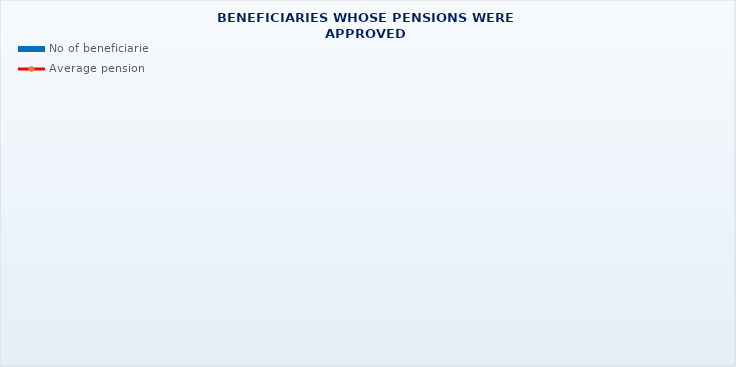
| Category | No of beneficiaries |
|---|---|
| Authorised officials in internal affairs, judicial officers and workers engaged in demining work: | 17264 |
| Active military personnel - DVO  | 15756 |
| Croatian Homeland Army veterans mobilised from 1941 to 1945 | 3783 |
| Former political prisoners | 2748 |
| Croatian Veterans from the Homeland War - ZOHBDR (Act on Croatian Homeland War Veterans and Their Family Members) | 71193 |
| Pensions approved under general regulations and determined according to the Act on the Rights of Croatian Homeland War Veterans and their Family Members (ZOHBDR), in 2017 (Art. 27, 35, 48 and 49, paragraph 2)    | 44387 |
| Former Yugoslav People's Army members - JNA   | 5245 |
| Former Yugoslav People's Army members - JNA - Art. 185 of Pension Insurance Act (ZOMO)  | 145 |
| National Liberation War veterans - NOR | 9101 |
| Members of the Croatian Parliament, members of the Government, judges of the Constitutional Court and the Auditor General | 673 |
| Members of the Parliamentary Executive Council and administratively retired federal civil servants  (relates to the former SFRY) | 92 |
| Former officials of federal bodies o the former SFRJ -  Article 38 of the Pension Insurance Act (ZOMO) | 30 |
| Full members of the Croatian Academy of Sciences and Arts - HAZU | 138 |
| Miners from the Istrian coal mines "Tupljak" d.d. Labin  | 254 |
| Workers professionally exposed to asbestos | 865 |
| Insurees - crew members on a ship in international and national navigation  - Article  129, paragraph 2 of the Maritime Code | 183 |
| Members of the Croatian Defence Council - HVO  | 6703 |